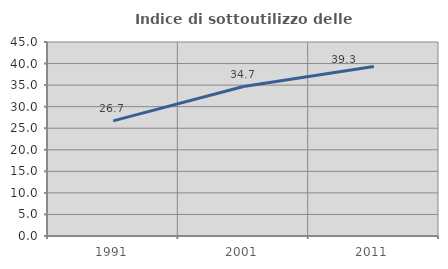
| Category | Indice di sottoutilizzo delle abitazioni  |
|---|---|
| 1991.0 | 26.711 |
| 2001.0 | 34.672 |
| 2011.0 | 39.314 |